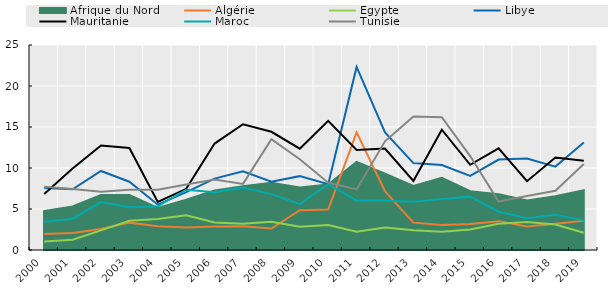
| Category | Algérie | Égypte | Libye | Mauritanie | Maroc | Tunisie |
|---|---|---|---|---|---|---|
| 2000.0 | 1.945 | 1.046 | 7.561 | 6.816 | 3.452 | 7.703 |
| 2001.0 | 2.071 | 1.259 | 7.407 | 9.936 | 3.813 | 7.427 |
| 2002.0 | 2.566 | 2.392 | 9.637 | 12.746 | 5.85 | 7.119 |
| 2003.0 | 3.337 | 3.555 | 8.329 | 12.432 | 5.225 | 7.35 |
| 2004.0 | 2.9 | 3.793 | 5.526 | 5.864 | 5.342 | 7.338 |
| 2005.0 | 2.759 | 4.24 | 7.063 | 7.463 | 7.353 | 7.985 |
| 2006.0 | 2.864 | 3.368 | 8.709 | 12.979 | 7.053 | 8.6 |
| 2007.0 | 2.904 | 3.211 | 9.593 | 15.336 | 7.61 | 8.062 |
| 2008.0 | 2.619 | 3.435 | 8.336 | 14.414 | 6.812 | 13.505 |
| 2009.0 | 4.858 | 2.832 | 9.006 | 12.355 | 5.6 | 11.065 |
| 2010.0 | 4.927 | 3.045 | 8.008 | 15.746 | 8.031 | 8.207 |
| 2011.0 | 14.349 | 2.22 | 22.321 | 12.208 | 6.018 | 7.387 |
| 2012.0 | 7.158 | 2.736 | 14.346 | 12.369 | 6.028 | 13.254 |
| 2013.0 | 3.335 | 2.401 | 10.597 | 8.423 | 5.899 | 16.292 |
| 2014.0 | 3.051 | 2.227 | 10.365 | 14.674 | 6.219 | 16.201 |
| 2015.0 | 3.173 | 2.499 | 9.039 | 10.396 | 6.508 | 11.454 |
| 2016.0 | 3.52 | 3.21 | 11.029 | 12.403 | 4.666 | 5.913 |
| 2017.0 | 2.874 | 3.424 | 11.163 | 8.393 | 3.873 | 6.591 |
| 2018.0 | 3.199 | 3.113 | 10.17 | 11.276 | 4.285 | 7.218 |
| 2019.0 | 3.576 | 2.1 | 13.1 | 10.878 | 3.614 | 10.477 |